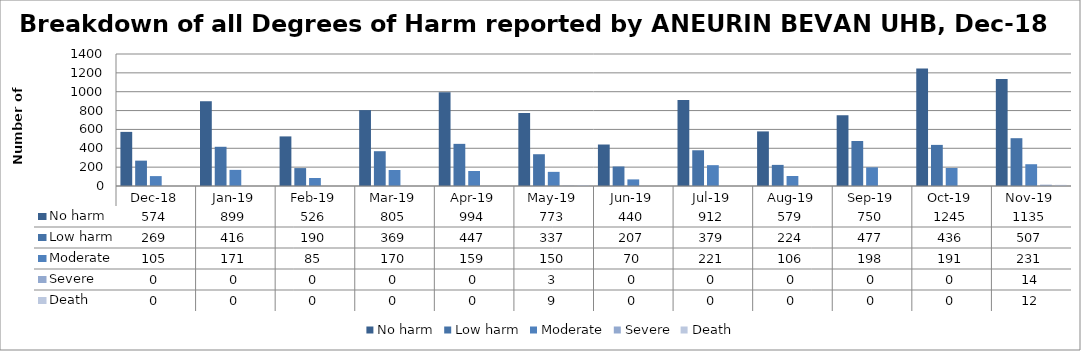
| Category | No harm | Low harm | Moderate | Severe | Death |
|---|---|---|---|---|---|
| Dec-18 | 574 | 269 | 105 | 0 | 0 |
| Jan-19 | 899 | 416 | 171 | 0 | 0 |
| Feb-19 | 526 | 190 | 85 | 0 | 0 |
| Mar-19 | 805 | 369 | 170 | 0 | 0 |
| Apr-19 | 994 | 447 | 159 | 0 | 0 |
| May-19 | 773 | 337 | 150 | 3 | 9 |
| Jun-19 | 440 | 207 | 70 | 0 | 0 |
| Jul-19 | 912 | 379 | 221 | 0 | 0 |
| Aug-19 | 579 | 224 | 106 | 0 | 0 |
| Sep-19 | 750 | 477 | 198 | 0 | 0 |
| Oct-19 | 1245 | 436 | 191 | 0 | 0 |
| Nov-19 | 1135 | 507 | 231 | 14 | 12 |